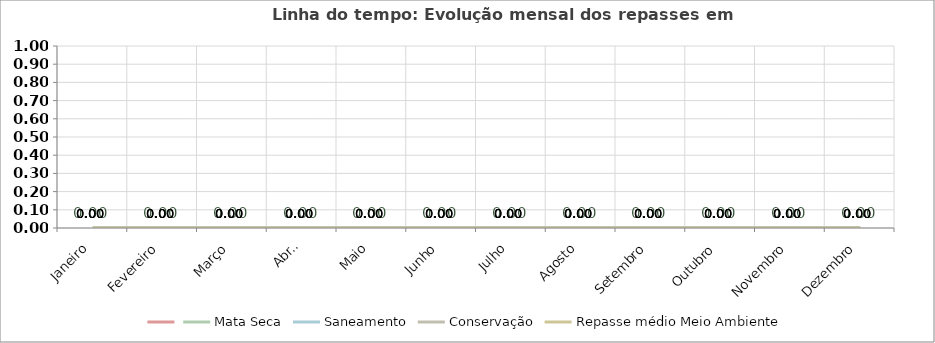
| Category | Series 0 | Mata Seca | Saneamento | Conservação | Repasse médio Meio Ambiente |
|---|---|---|---|---|---|
| Janeiro | 0 | 0 | 0 | 0 | 0 |
| Fevereiro | 0 | 0 | 0 | 0 | 0 |
| Março | 0 | 0 | 0 | 0 | 0 |
| Abril | 0 | 0 | 0 | 0 | 0 |
| Maio | 0 | 0 | 0 | 0 | 0 |
| Junho | 0 | 0 | 0 | 0 | 0 |
| Julho | 0 | 0 | 0 | 0 | 0 |
| Agosto | 0 | 0 | 0 | 0 | 0 |
| Setembro | 0 | 0 | 0 | 0 | 0 |
| Outubro | 0 | 0 | 0 | 0 | 0 |
| Novembro | 0 | 0 | 0 | 0 | 0 |
| Dezembro | 0 | 0 | 0 | 0 | 0 |